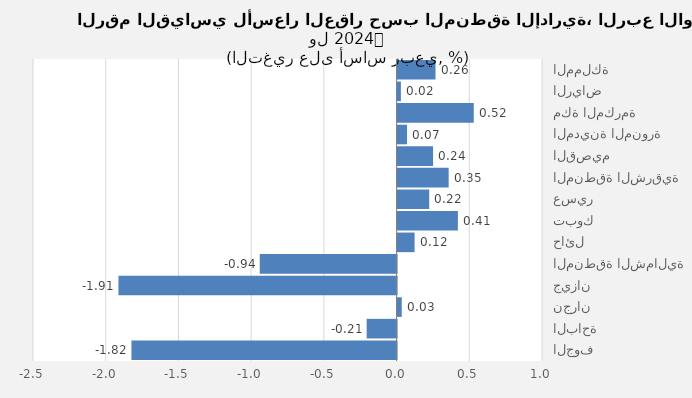
| Category | 2024 |
|---|---|
| المملكة | 0.261 |
| الرياض | 0.023 |
| مكة المكرمة | 0.524 |
| المدينة المنورة | 0.065 |
| القصيم | 0.244 |
| المنطقة الشرقية | 0.351 |
| عسير | 0.217 |
| تبوك | 0.415 |
| حائل | 0.117 |
| المنطقة الشمالية | -0.941 |
| جيزان | -1.912 |
| نجران | 0.029 |
| الباحة | -0.206 |
| الجوف | -1.823 |